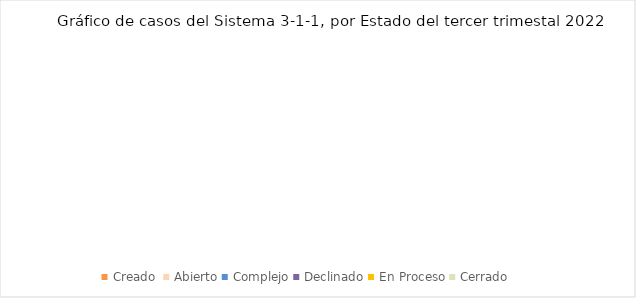
| Category | Series 0 |
|---|---|
| Creado  | 0 |
| Abierto | 0 |
| Complejo | 0 |
| Declinado | 0 |
| En Proceso | 0 |
| Cerrado  | 0 |